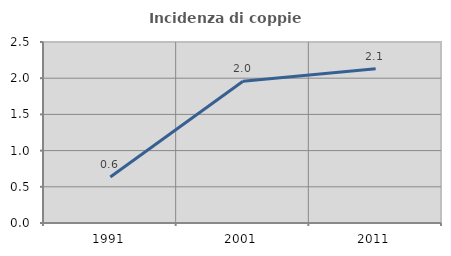
| Category | Incidenza di coppie miste |
|---|---|
| 1991.0 | 0.636 |
| 2001.0 | 1.958 |
| 2011.0 | 2.13 |